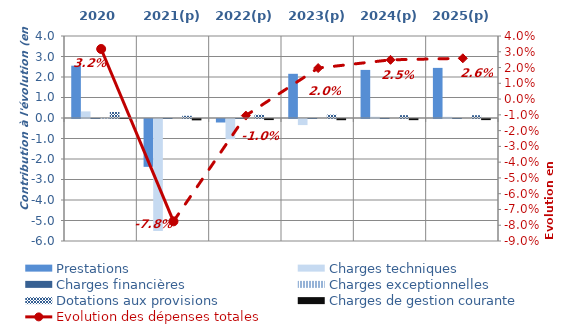
| Category | Prestations | Charges techniques | Charges financières | Charges exceptionnelles | Dotations aux provisions | Charges de gestion courante |
|---|---|---|---|---|---|---|
| 2020 | 2.552 | 0.323 | 0 | 0.005 | 0.292 | 0.005 |
| 2021(p) | -2.334 | -5.461 | 0 | 0 | 0.108 | -0.066 |
| 2022(p) | -0.17 | -0.984 | 0 | 0 | 0.16 | -0.053 |
| 2023(p) | 2.156 | -0.297 | 0 | 0 | 0.166 | -0.059 |
| 2024(p) | 2.346 | 0.06 | 0 | 0 | 0.139 | -0.057 |
| 2025(p) | 2.445 | 0.059 | 0 | 0 | 0.136 | -0.054 |